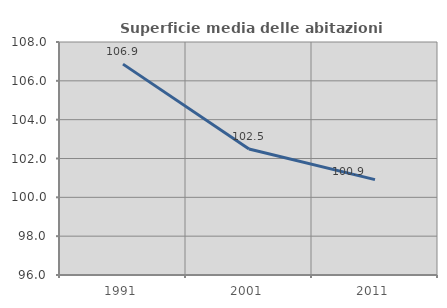
| Category | Superficie media delle abitazioni occupate |
|---|---|
| 1991.0 | 106.86 |
| 2001.0 | 102.488 |
| 2011.0 | 100.912 |